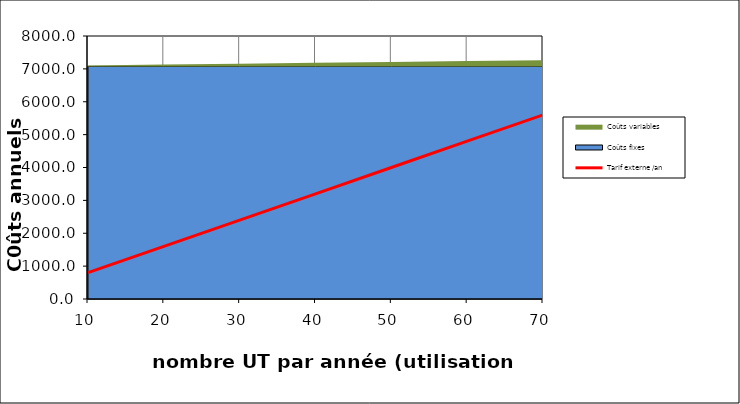
| Category | Tarif externe /an |
|---|---|
| 0 | 800 |
| 1 | 1600 |
| 2 | 2400 |
| 3 | 3200 |
| 4 | 4000 |
| 5 | 4800 |
| 6 | 5600 |